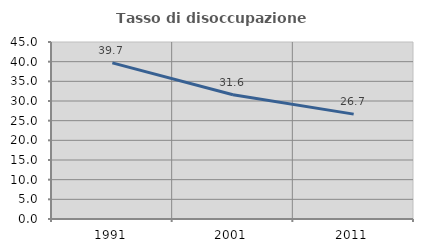
| Category | Tasso di disoccupazione giovanile  |
|---|---|
| 1991.0 | 39.683 |
| 2001.0 | 31.579 |
| 2011.0 | 26.667 |